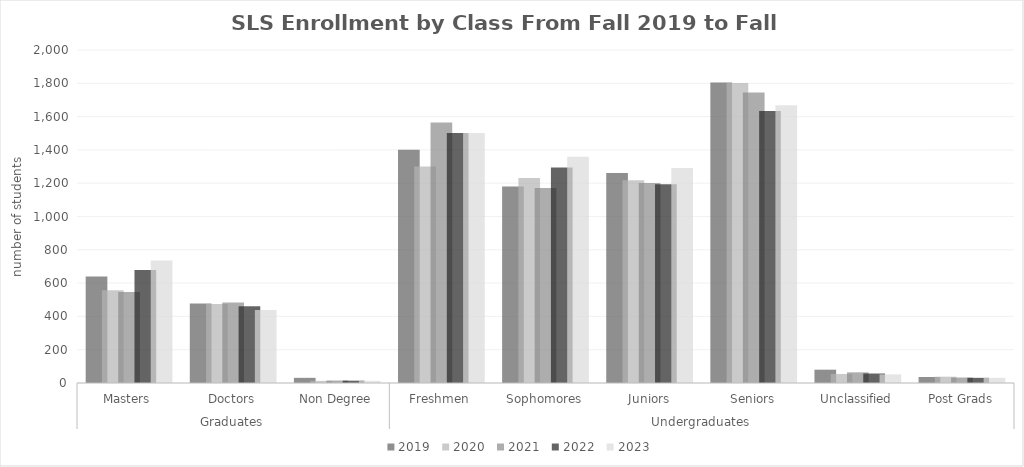
| Category | 2019  | 2020  | 2021  | 2022  | 2023  |
|---|---|---|---|---|---|
| 0 | 639 | 557 | 547 | 678 | 735 |
| 1 | 478 | 475 | 484 | 461 | 439 |
| 2 | 31 | 13 | 15 | 14 | 13 |
| 3 | 1401 | 1300 | 1565 | 1501 | 1501 |
| 4 | 1180 | 1231 | 1171 | 1295 | 1359 |
| 5 | 1262 | 1217 | 1201 | 1193 | 1292 |
| 6 | 1805 | 1802 | 1744 | 1633 | 1668 |
| 7 | 80 | 54 | 64 | 57 | 52 |
| 8 | 36 | 38 | 33 | 31 | 31 |